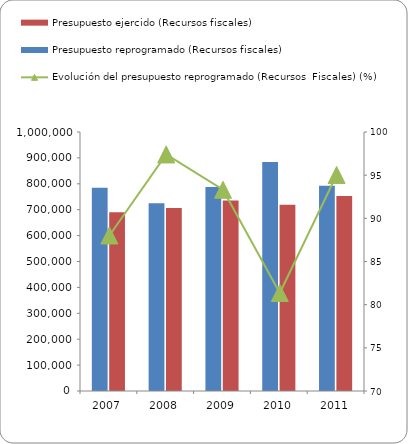
| Category | Presupuesto reprogramado (Recursos fiscales) | Presupuesto ejercido (Recursos fiscales)  |
|---|---|---|
| 2007 | 784356 | 690345 |
| 2008 | 725279 | 706418 |
| 2009 | 787943 | 735239 |
| 2010 | 884349 | 719451 |
| 2011 | 792234 | 752828 |